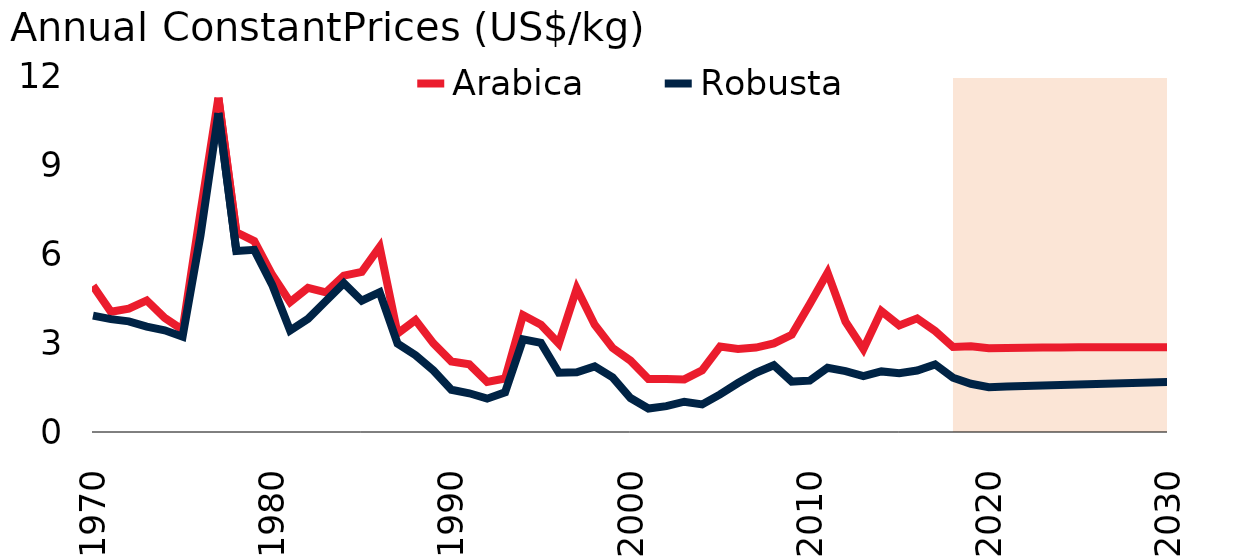
| Category | Arabica | Robusta |
|---|---|---|
| 1970.0 | 4.939 | 3.935 |
| 1971.0 | 4.063 | 3.816 |
| 1972.0 | 4.166 | 3.74 |
| 1973.0 | 4.447 | 3.561 |
| 1974.0 | 3.856 | 3.437 |
| 1975.0 | 3.45 | 3.22 |
| 1976.0 | 7.436 | 6.649 |
| 1977.0 | 11.3 | 10.784 |
| 1978.0 | 6.753 | 6.116 |
| 1979.0 | 6.452 | 6.159 |
| 1980.0 | 5.314 | 4.972 |
| 1981.0 | 4.393 | 3.431 |
| 1982.0 | 4.874 | 3.826 |
| 1983.0 | 4.72 | 4.429 |
| 1984.0 | 5.287 | 5.035 |
| 1985.0 | 5.413 | 4.437 |
| 1986.0 | 6.253 | 4.726 |
| 1987.0 | 3.33 | 2.989 |
| 1988.0 | 3.787 | 2.595 |
| 1989.0 | 2.998 | 2.079 |
| 1990.0 | 2.386 | 1.429 |
| 1991.0 | 2.287 | 1.309 |
| 1992.0 | 1.692 | 1.127 |
| 1993.0 | 1.807 | 1.341 |
| 1994.0 | 3.95 | 3.129 |
| 1995.0 | 3.625 | 3.014 |
| 1996.0 | 2.988 | 2.003 |
| 1997.0 | 4.851 | 2.021 |
| 1998.0 | 3.628 | 2.218 |
| 1999.0 | 2.842 | 1.847 |
| 2000.0 | 2.413 | 1.148 |
| 2001.0 | 1.793 | 0.793 |
| 2002.0 | 1.792 | 0.874 |
| 2003.0 | 1.778 | 1.023 |
| 2004.0 | 2.086 | 0.933 |
| 2005.0 | 2.887 | 1.271 |
| 2006.0 | 2.805 | 1.656 |
| 2007.0 | 2.854 | 2.001 |
| 2008.0 | 2.997 | 2.257 |
| 2009.0 | 3.287 | 1.704 |
| 2010.0 | 4.32 | 1.736 |
| 2011.0 | 5.384 | 2.169 |
| 2012.0 | 3.731 | 2.057 |
| 2013.0 | 2.804 | 1.892 |
| 2014.0 | 4.088 | 2.048 |
| 2015.0 | 3.603 | 1.984 |
| 2016.0 | 3.84 | 2.077 |
| 2017.0 | 3.415 | 2.287 |
| 2018.0 | 2.875 | 1.837 |
| 2019.0 | 2.895 | 1.63 |
| 2020.0 | 2.829 | 1.515 |
| 2021.0 | 2.839 | 1.535 |
| 2022.0 | 2.847 | 1.554 |
| 2023.0 | 2.853 | 1.572 |
| 2024.0 | 2.858 | 1.589 |
| 2025.0 | 2.862 | 1.606 |
| 2026.0 | 2.865 | 1.623 |
| 2027.0 | 2.867 | 1.64 |
| 2028.0 | 2.868 | 1.656 |
| 2029.0 | 2.868 | 1.671 |
| 2030.0 | 2.868 | 1.687 |